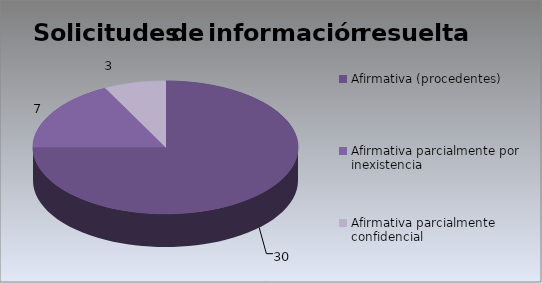
| Category | Series 0 |
|---|---|
| Afirmativa (procedentes) | 30 |
| Afirmativa parcialmente por inexistencia | 7 |
| Afirmativa parcialmente confidencial | 3 |